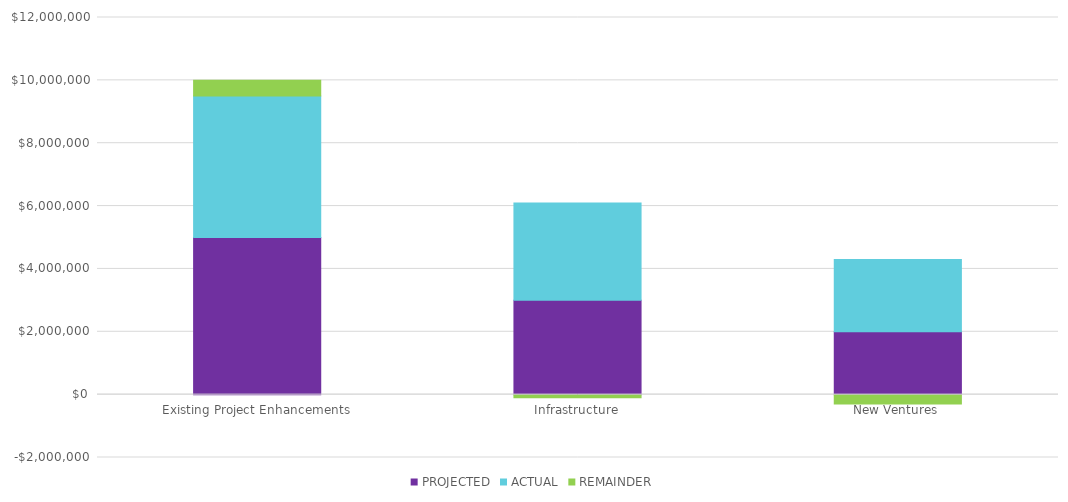
| Category | PROJECTED | ACTUAL | REMAINDER |
|---|---|---|---|
| Existing Project Enhancements | 5000000 | 4500000 | 500000 |
| Infrastructure | 3000000 | 3100000 | -100000 |
| New Ventures | 2000000 | 2300000 | -300000 |